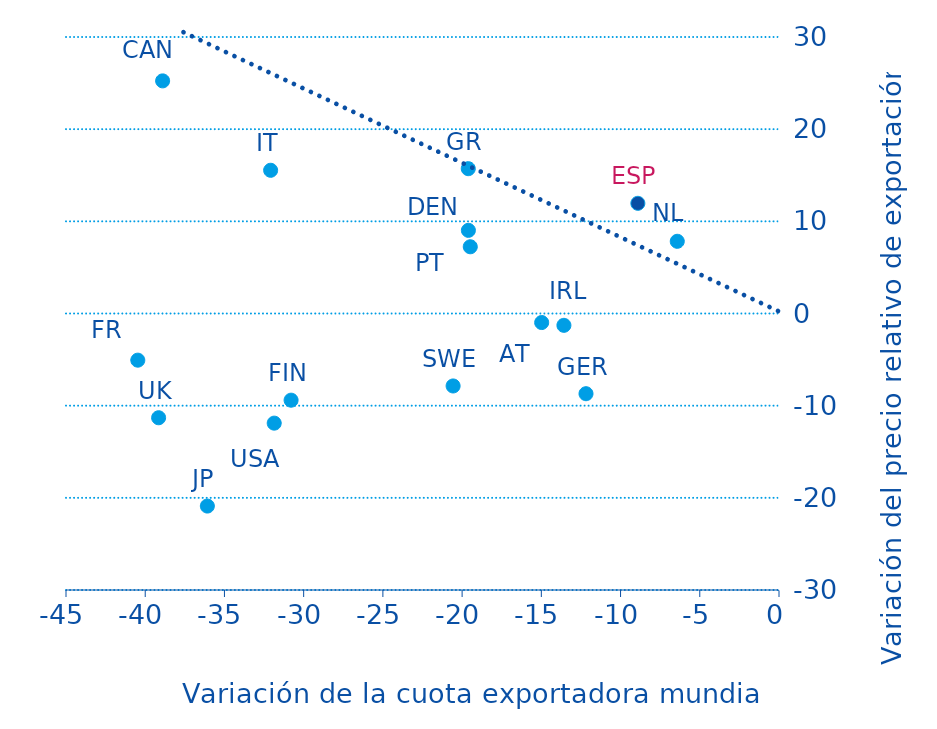
| Category | Series 0 |
|---|---|
| -40.46883677761323 | -5.064 |
| -39.15476768052284 | -11.311 |
| -38.90174167622648 | 25.239 |
| -36.07878868120247 | -20.891 |
| -32.08471364668416 | 15.538 |
| -31.85866041128943 | -11.897 |
| -30.79360779235214 | -9.407 |
| -20.5681340003148 | -7.862 |
| -19.61176440789129 | 15.713 |
| -19.6037331451259 | 9.022 |
| -19.48532410582189 | 7.241 |
| -14.97872726594984 | -0.981 |
| -13.57487865935972 | -1.284 |
| -12.18089900653774 | -8.702 |
| -8.908206895251421 | 11.955 |
| -6.420786049555029 | 7.833 |